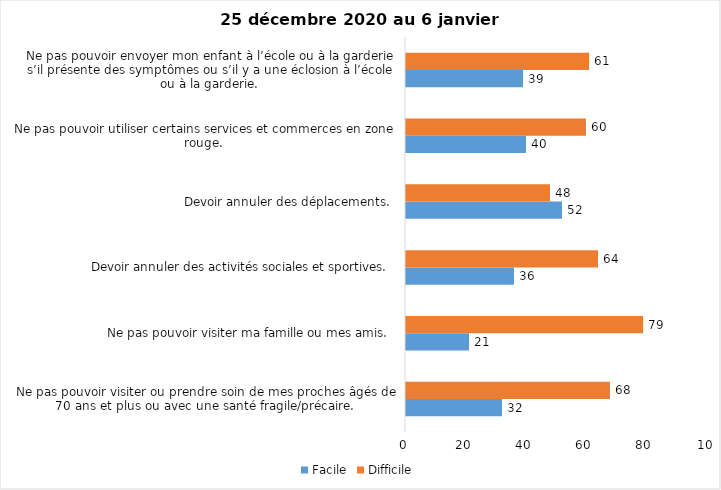
| Category | Facile | Difficile |
|---|---|---|
| Ne pas pouvoir visiter ou prendre soin de mes proches âgés de 70 ans et plus ou avec une santé fragile/précaire.  | 32 | 68 |
| Ne pas pouvoir visiter ma famille ou mes amis.  | 21 | 79 |
| Devoir annuler des activités sociales et sportives.  | 36 | 64 |
| Devoir annuler des déplacements.  | 52 | 48 |
| Ne pas pouvoir utiliser certains services et commerces en zone rouge.  | 40 | 60 |
| Ne pas pouvoir envoyer mon enfant à l’école ou à la garderie s’il présente des symptômes ou s’il y a une éclosion à l’école ou à la garderie.  | 39 | 61 |